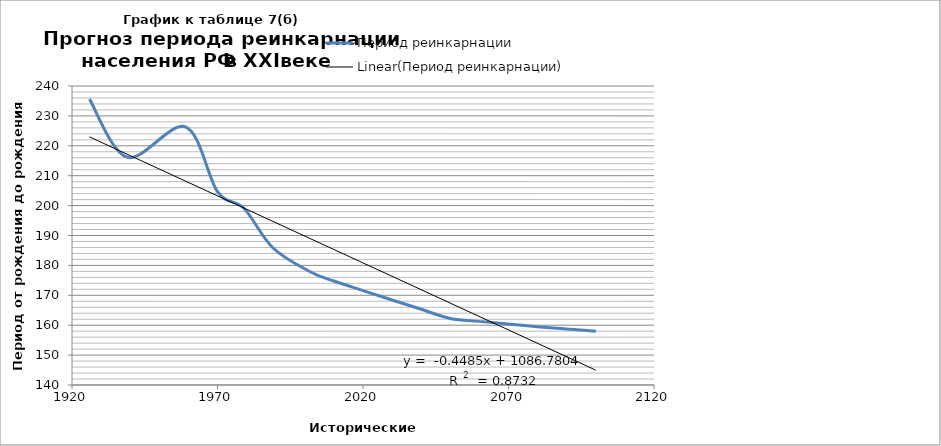
| Category | Период реинкарнации |
|---|---|
| 1926.0 | 235.589 |
| 1939.0 | 216.16 |
| 1959.0 | 226.35 |
| 1970.0 | 204.647 |
| 1979.0 | 199.187 |
| 1989.0 | 185.895 |
| 2002.0 | 177.797 |
| 2010.0 | 174.77 |
| 2020.0 | 171.58 |
| 2030.0 | 168.43 |
| 2040.0 | 165.32 |
| 2050.0 | 162.25 |
| 2060.0 | 161.28 |
| 2070.0 | 160.37 |
| 2080.0 | 159.52 |
| 2090.0 | 158.73 |
| 2100.0 | 158 |